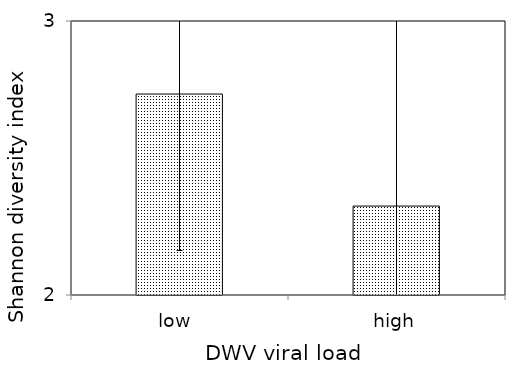
| Category | mean |
|---|---|
| low  | 2.733 |
| high | 2.325 |